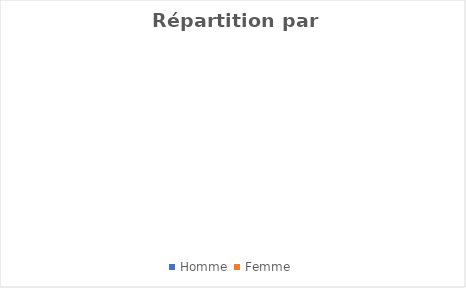
| Category | Sexe |
|---|---|
| Homme  | 0 |
| Femme  | 0 |